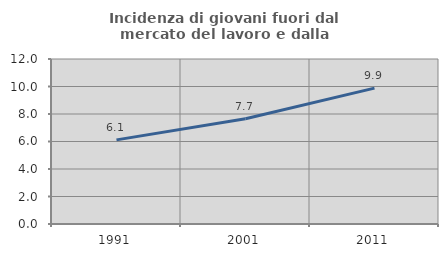
| Category | Incidenza di giovani fuori dal mercato del lavoro e dalla formazione  |
|---|---|
| 1991.0 | 6.117 |
| 2001.0 | 7.653 |
| 2011.0 | 9.881 |